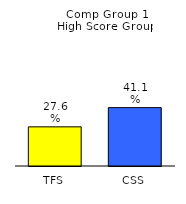
| Category | Series 0 |
|---|---|
| TFS | 0.276 |
| CSS | 0.411 |